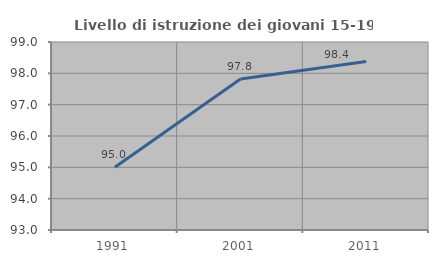
| Category | Livello di istruzione dei giovani 15-19 anni |
|---|---|
| 1991.0 | 95 |
| 2001.0 | 97.82 |
| 2011.0 | 98.378 |